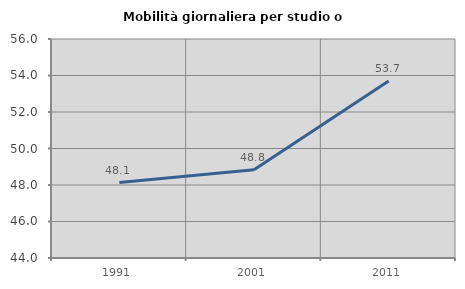
| Category | Mobilità giornaliera per studio o lavoro |
|---|---|
| 1991.0 | 48.136 |
| 2001.0 | 48.834 |
| 2011.0 | 53.699 |